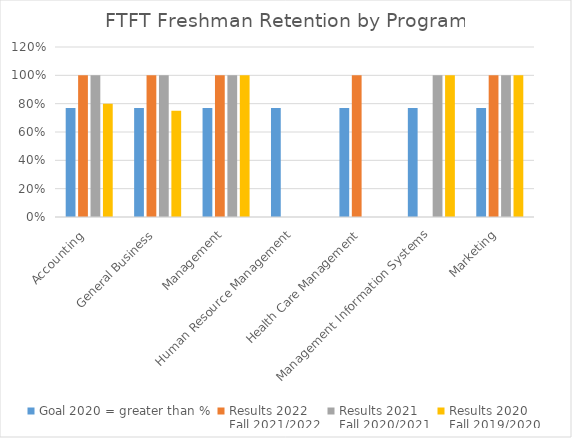
| Category | Goal 2020 = greater than % | Results 2022
Fall 2021/2022 | Results 2021
Fall 2020/2021 | Results 2020
Fall 2019/2020 |
|---|---|---|---|---|
| Accounting  | 0.77 | 1 | 1 | 0.8 |
| General Business | 0.77 | 1 | 1 | 0.75 |
| Management | 0.77 | 1 | 1 | 1 |
| Human Resource Management | 0.77 | 0 | 0 | 0 |
| Health Care Management | 0.77 | 1 | 0 | 0 |
| Management Information Systems | 0.77 | 0 | 1 | 1 |
| Marketing | 0.77 | 1 | 1 | 1 |